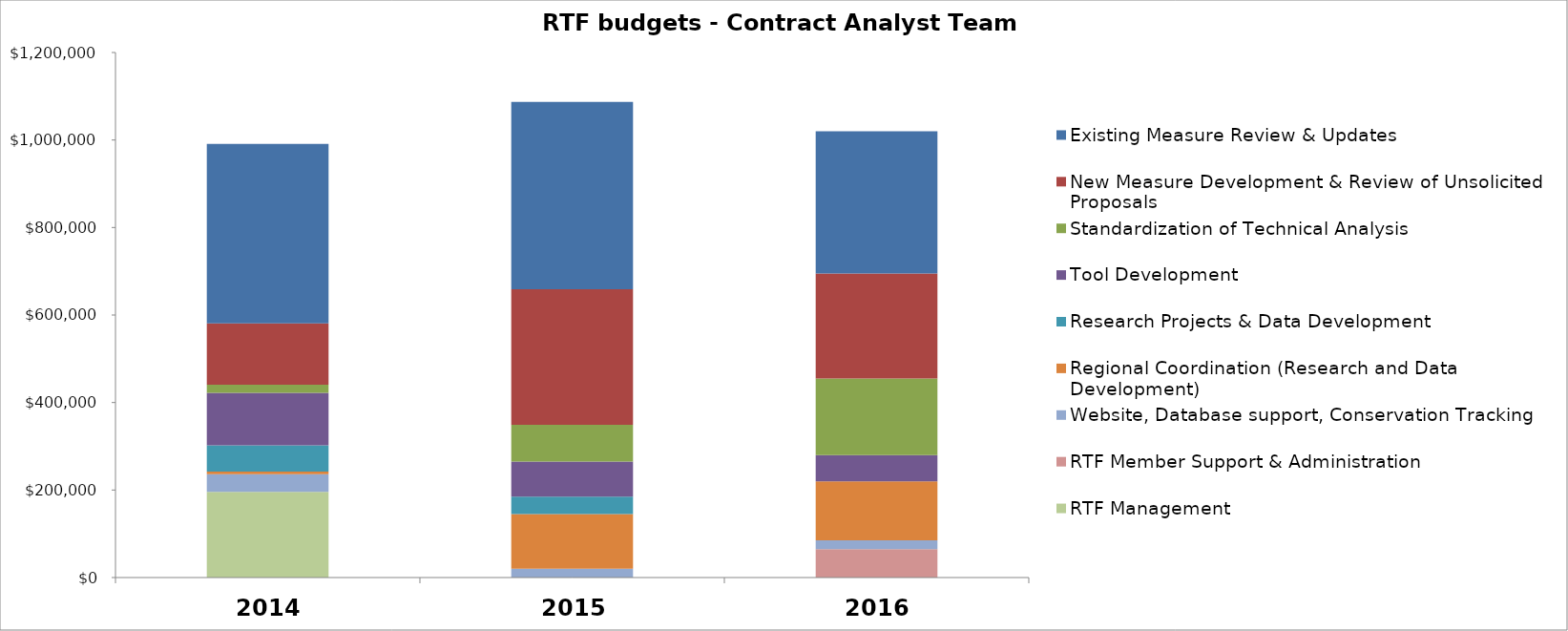
| Category | RTF Management | RTF Member Support & Administration | Website, Database support, Conservation Tracking  | Regional Coordination (Research and Data Development) | Research Projects & Data Development | Tool Development | Standardization of Technical Analysis | New Measure Development & Review of Unsolicited Proposals | Existing Measure Review & Updates |
|---|---|---|---|---|---|---|---|---|---|
| 0 | 196000 | 0 | 40000 | 6000 | 60000 | 120000 | 19000 | 140000 | 410000 |
| 1 | 0 | 0 | 20000 | 125000 | 40000 | 80000 | 84000 | 310000 | 428000 |
| 2 | 0 | 65000 | 20000 | 135000 | 0 | 60000 | 175000 | 240000 | 325000 |